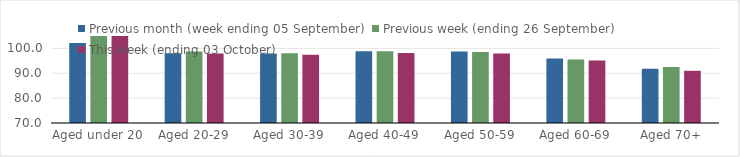
| Category | Previous month (week ending 05 September) | Previous week (ending 26 September) | This week (ending 03 October) |
|---|---|---|---|
| Aged under 20 | 102.15 | 105.97 | 106.59 |
| Aged 20-29 | 98.07 | 98.75 | 97.93 |
| Aged 30-39 | 98 | 98.06 | 97.45 |
| Aged 40-49 | 98.88 | 98.89 | 98.21 |
| Aged 50-59 | 98.75 | 98.56 | 97.94 |
| Aged 60-69 | 95.99 | 95.51 | 95.1 |
| Aged 70+ | 91.84 | 92.57 | 91.03 |